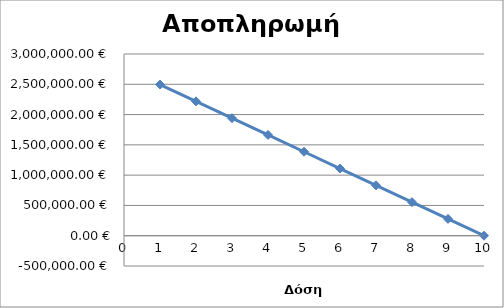
| Category | Series 0 |
|---|---|
| 1.0 | 2495584.13 |
| 2.0 | 2218297 |
| 3.0 | 1941009.87 |
| 4.0 | 1663722.74 |
| 5.0 | 1386435.61 |
| 6.0 | 1109148.48 |
| 7.0 | 831861.35 |
| 8.0 | 554574.22 |
| 9.0 | 277287.09 |
| 10.0 | -0.04 |